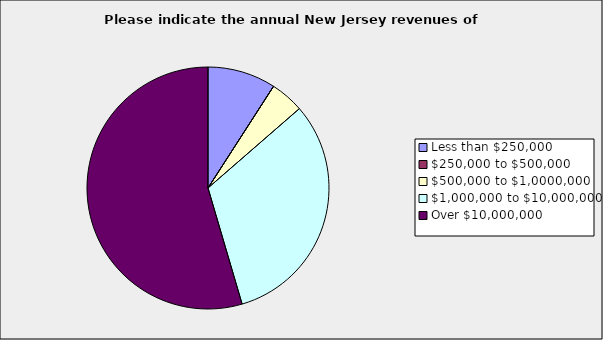
| Category | Series 0 |
|---|---|
| Less than $250,000 | 0.091 |
| $250,000 to $500,000 | 0 |
| $500,000 to $1,0000,000 | 0.045 |
| $1,000,000 to $10,000,000 | 0.318 |
| Over $10,000,000 | 0.545 |